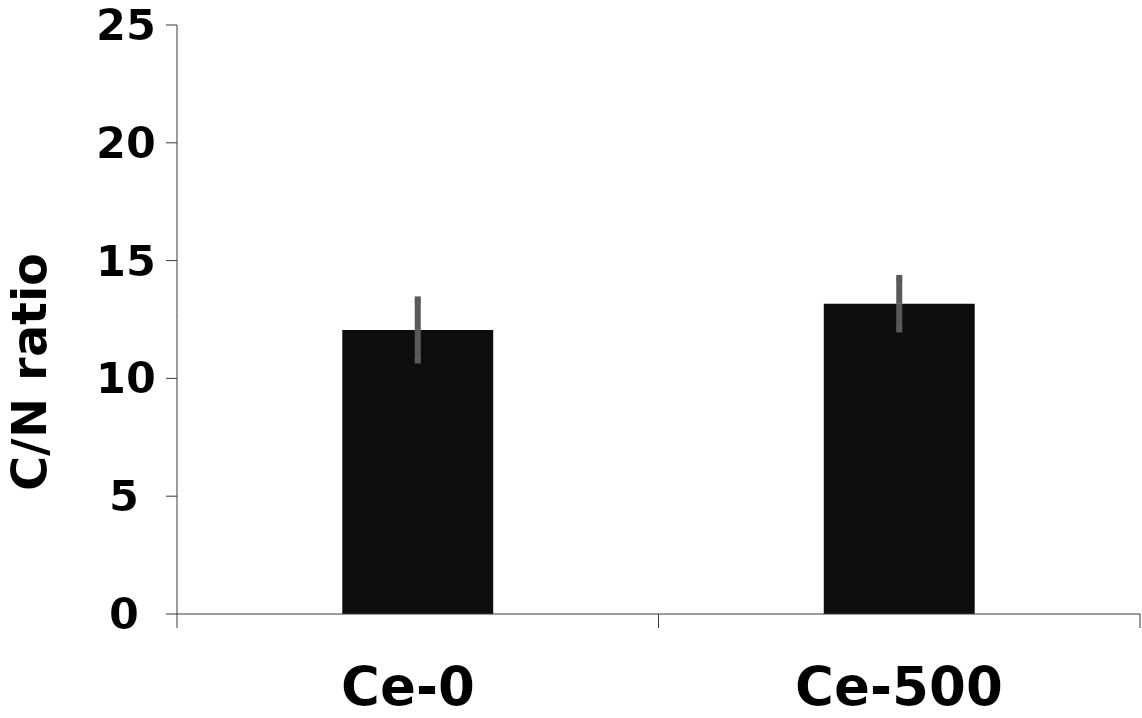
| Category | C/N |
|---|---|
| Ce-0 | 12.057 |
| Ce-500 | 13.171 |